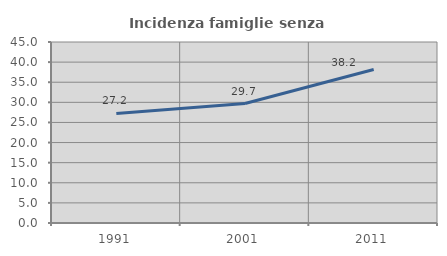
| Category | Incidenza famiglie senza nuclei |
|---|---|
| 1991.0 | 27.241 |
| 2001.0 | 29.708 |
| 2011.0 | 38.158 |